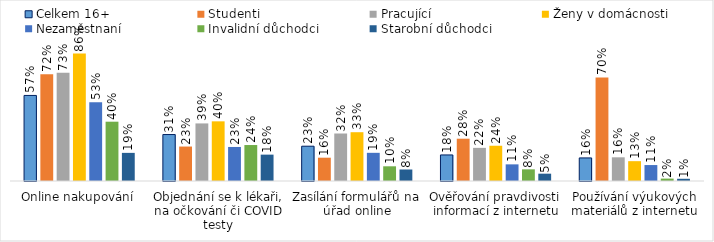
| Category | Celkem 16+ | Studenti | Pracující | Ženy v domácnosti | Nezaměstnaní | Invalidní důchodci | Starobní důchodci |
|---|---|---|---|---|---|---|---|
| Online nakupování | 0.575 | 0.717 | 0.727 | 0.856 | 0.528 | 0.398 | 0.189 |
| Objednání se k lékaři, na očkování či COVID testy | 0.312 | 0.231 | 0.387 | 0.401 | 0.229 | 0.242 | 0.177 |
| Zasílání formulářů na úřad online | 0.234 | 0.157 | 0.319 | 0.328 | 0.189 | 0.099 | 0.077 |
| Ověřování pravdivosti informací z internetu | 0.175 | 0.284 | 0.223 | 0.237 | 0.112 | 0.078 | 0.049 |
| Používání výukových materiálů z internetu | 0.155 | 0.695 | 0.159 | 0.133 | 0.107 | 0.016 | 0.015 |